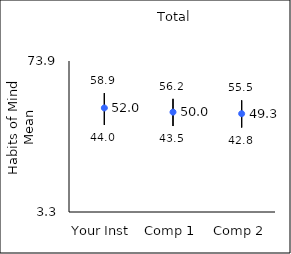
| Category | 25th percentile | 75th percentile | Mean |
|---|---|---|---|
| Your Inst | 44 | 58.9 | 51.95 |
| Comp 1 | 43.5 | 56.2 | 50 |
| Comp 2 | 42.8 | 55.5 | 49.27 |